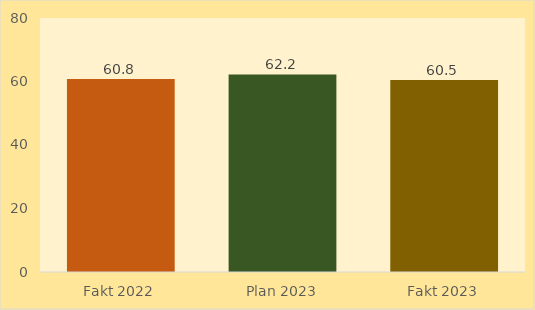
| Category | Tatimi mbi Vlerën e Shtuar |
|---|---|
| Fakt 2022 | 60.821 |
| Plan 2023 | 62.218 |
| Fakt 2023 | 60.497 |